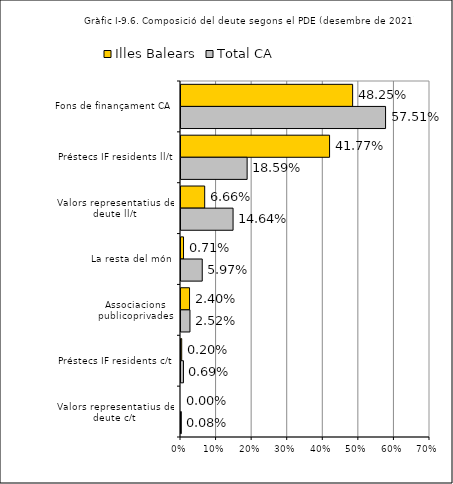
| Category | Illes Balears | Total CA |
|---|---|---|
| Fons de finançament CA | 0.483 | 0.575 |
| Préstecs IF residents ll/t | 0.418 | 0.186 |
| Valors representatius de deute ll/t | 0.067 | 0.146 |
| La resta del món | 0.007 | 0.06 |
| Associacions publicoprivades | 0.024 | 0.025 |
| Préstecs IF residents c/t | 0.002 | 0.007 |
| Valors representatius de deute c/t | 0 | 0.001 |